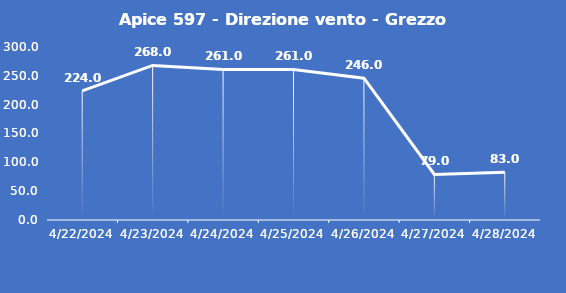
| Category | Apice 597 - Direzione vento - Grezzo (°N) |
|---|---|
| 4/22/24 | 224 |
| 4/23/24 | 268 |
| 4/24/24 | 261 |
| 4/25/24 | 261 |
| 4/26/24 | 246 |
| 4/27/24 | 79 |
| 4/28/24 | 83 |